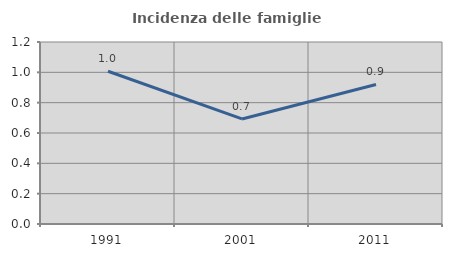
| Category | Incidenza delle famiglie numerose |
|---|---|
| 1991.0 | 1.007 |
| 2001.0 | 0.693 |
| 2011.0 | 0.92 |